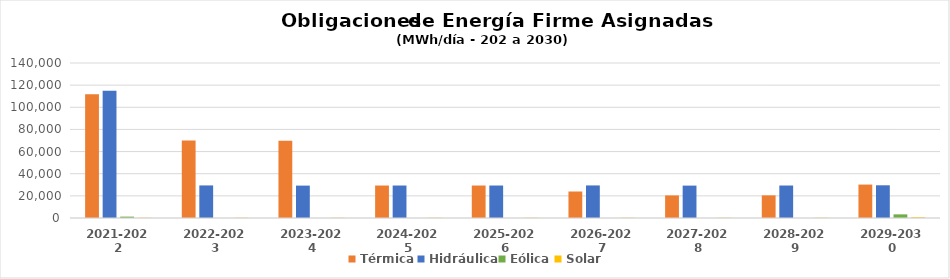
| Category | Térmica | Hidráulica | Eólica | Solar |
|---|---|---|---|---|
| 2021-2022 | 111854.115 | 114915.107 | 1242.485 | 236.995 |
| 2022-2023 | 70106.361 | 29417.576 | 0 | 237.644 |
| 2023-2024 | 69723.79 | 29257.044 | 0 | 236.347 |
| 2024-2025 | 29337.384 | 29337.2 | 0 | 236.995 |
| 2025-2026 | 29337.384 | 29337.2 | 0 | 236.995 |
| 2026-2027 | 23930.317 | 29417.576 | 0 | 237.644 |
| 2027-2028 | 20389.077 | 29257.044 | 0 | 236.347 |
| 2028-2029 | 20444.937 | 29337.2 | 0 | 236.995 |
| 2029-2030 | 30188.932 | 29541.085 | 3285.353 | 761.46 |